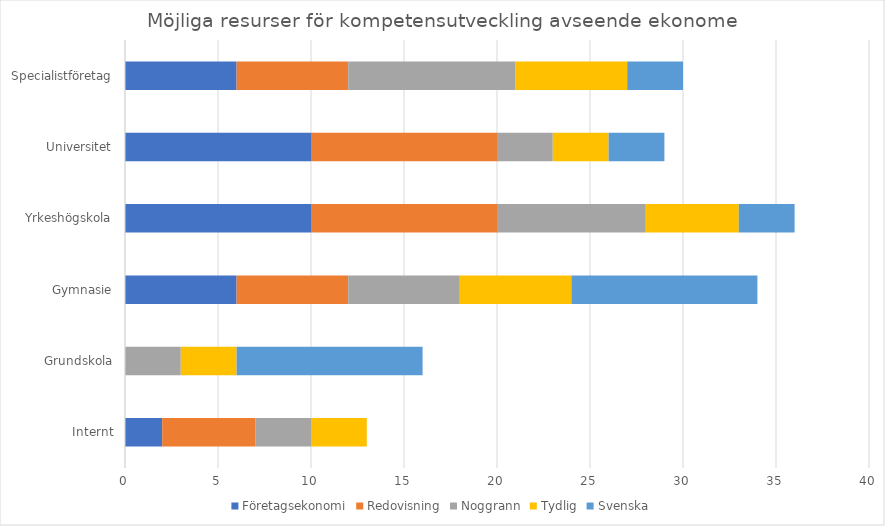
| Category | Företagsekonomi | Redovisning | Noggrann | Tydlig | Svenska |
|---|---|---|---|---|---|
| Internt | 2 | 5 | 3 | 3 | 0 |
| Grundskola | 0 | 0 | 3 | 3 | 10 |
| Gymnasie | 6 | 6 | 6 | 6 | 10 |
| Yrkeshögskola | 10 | 10 | 8 | 5 | 3 |
| Universitet | 10 | 10 | 3 | 3 | 3 |
| Specialistföretag | 6 | 6 | 9 | 6 | 3 |